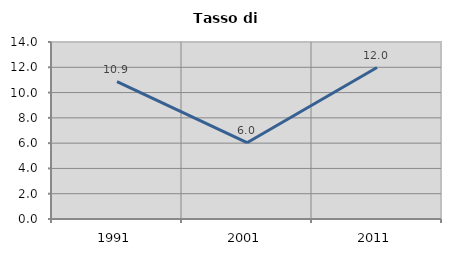
| Category | Tasso di disoccupazione   |
|---|---|
| 1991.0 | 10.865 |
| 2001.0 | 6.034 |
| 2011.0 | 11.977 |